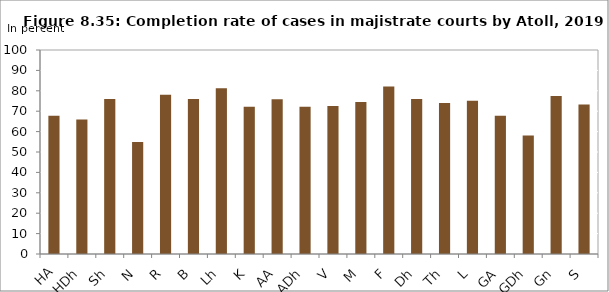
| Category | Series 0 |
|---|---|
| HA | 67.79 |
| HDh | 65.947 |
| Sh | 76.03 |
| N | 54.926 |
| R | 78.01 |
| B | 75.973 |
| Lh | 81.281 |
| K | 72.198 |
| AA | 75.849 |
| ADh | 72.12 |
| V | 72.581 |
| M | 74.51 |
| F | 82.114 |
| Dh | 75.954 |
| Th | 74.007 |
| L | 75.164 |
| GA | 67.745 |
| GDh | 58.08 |
| Gn | 77.476 |
| S | 73.333 |